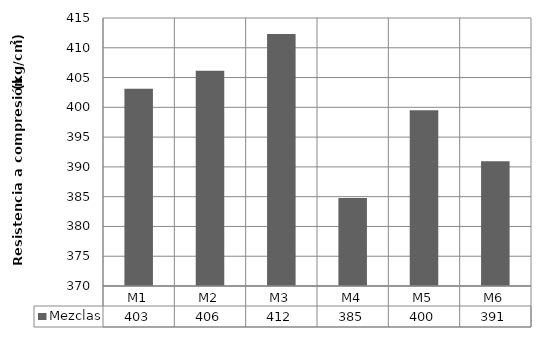
| Category | Mezclas |
|---|---|
| M1 | 403.1 |
| M2 | 406.123 |
| M3 | 412.315 |
| M4 | 384.758 |
| M5 | 399.528 |
| M6 | 390.945 |